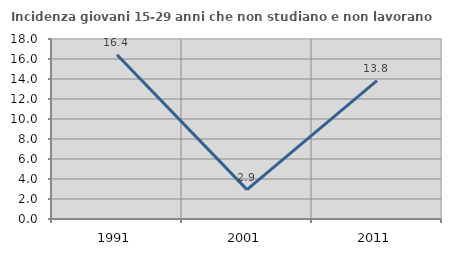
| Category | Incidenza giovani 15-29 anni che non studiano e non lavorano  |
|---|---|
| 1991.0 | 16.429 |
| 2001.0 | 2.941 |
| 2011.0 | 13.846 |